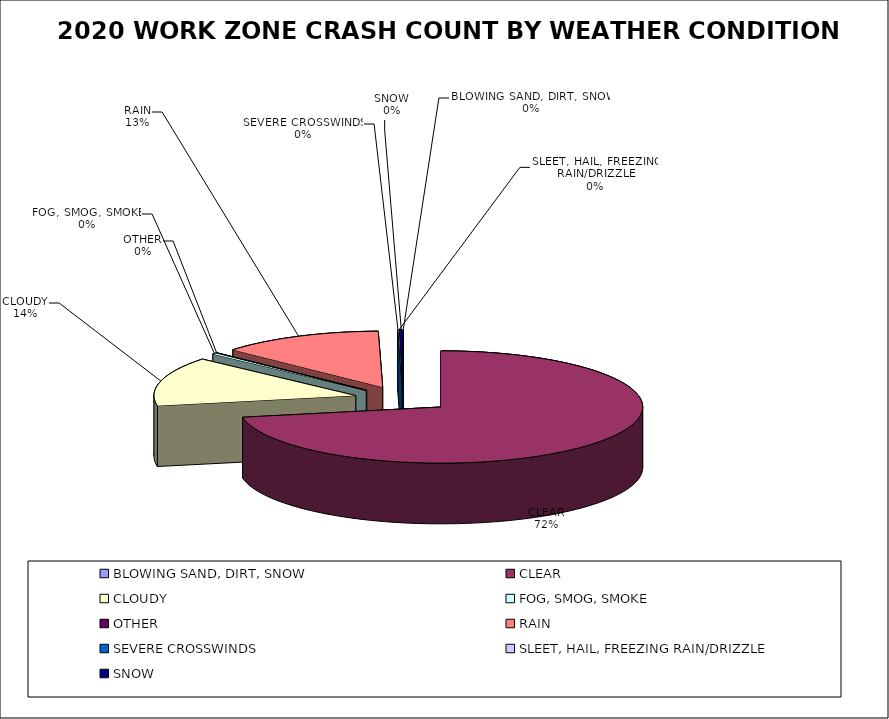
| Category | Series 0 | Series 1 |
|---|---|---|
| BLOWING SAND, DIRT, SNOW | 0 | 0 |
| CLEAR | 4283 | 0.721 |
| CLOUDY | 842 | 0.142 |
| FOG, SMOG, SMOKE | 23 | 0.004 |
| OTHER | 2 | 0 |
| RAIN | 771 | 0.13 |
| SEVERE CROSSWINDS | 3 | 0.001 |
| SLEET, HAIL, FREEZING RAIN/DRIZZLE | 4 | 0.001 |
| SNOW | 14 | 0.002 |